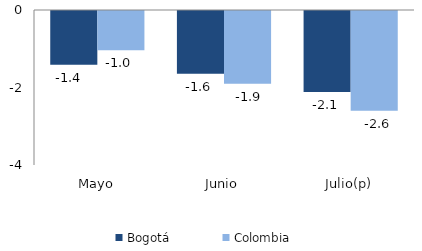
| Category | Bogotá | Colombia |
|---|---|---|
| Mayo | -1.386 | -1.014 |
| Junio | -1.622 | -1.875 |
| Julio(p) | -2.09 | -2.573 |